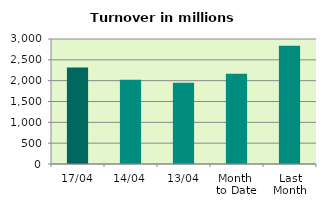
| Category | Series 0 |
|---|---|
| 17/04 | 2316.786 |
| 14/04 | 2021.285 |
| 13/04 | 1949.101 |
| Month 
to Date | 2166.201 |
| Last
Month | 2840.905 |